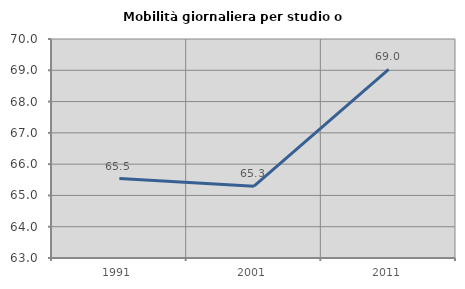
| Category | Mobilità giornaliera per studio o lavoro |
|---|---|
| 1991.0 | 65.54 |
| 2001.0 | 65.296 |
| 2011.0 | 69.03 |